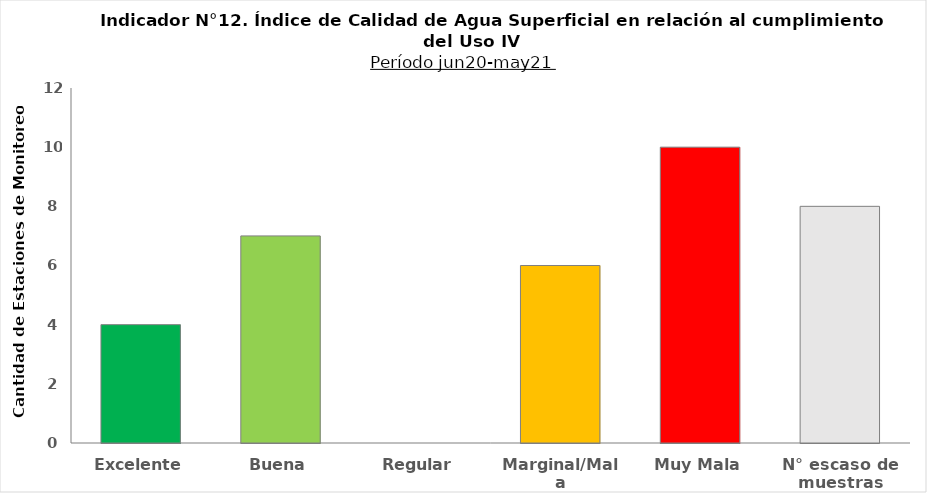
| Category | Series 0 |
|---|---|
| Excelente | 4 |
| Buena | 7 |
| Regular | 0 |
| Marginal/Mala | 6 |
| Muy Mala | 10 |
| N° escaso de muestras | 8 |